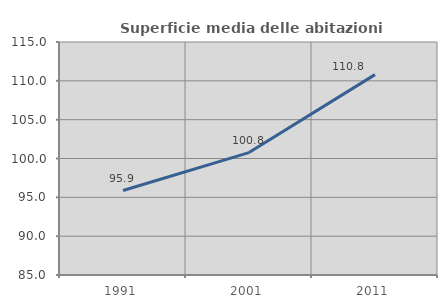
| Category | Superficie media delle abitazioni occupate |
|---|---|
| 1991.0 | 95.878 |
| 2001.0 | 100.76 |
| 2011.0 | 110.796 |